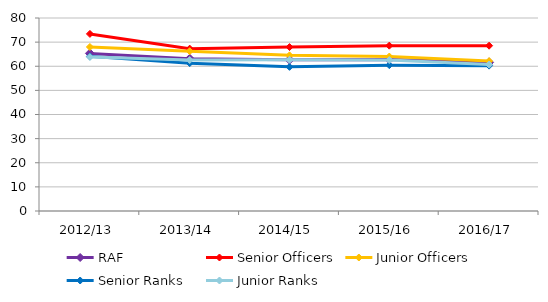
| Category | RAF | Senior Officers | Junior Officers | Senior Ranks | Junior Ranks |
|---|---|---|---|---|---|
| 2012/13 | 65.335 | 73.412 | 67.988 | 64.092 | 63.796 |
| 2013/14 | 63.141 | 67.301 | 66.234 | 61.294 | 62.575 |
| 2014/15 | 62.704 | 67.952 | 64.518 | 59.753 | 62.682 |
| 2015/16 | 62.843 | 68.535 | 64.021 | 60.455 | 62.565 |
| 2016/17 | 61.611 | 68.519 | 62.135 | 60.254 | 60.684 |